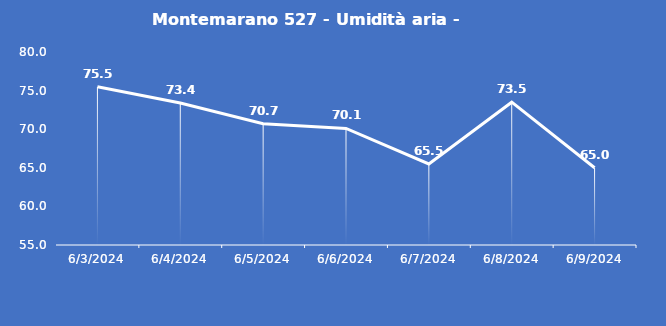
| Category | Montemarano 527 - Umidità aria - Grezzo (%) |
|---|---|
| 6/3/24 | 75.5 |
| 6/4/24 | 73.4 |
| 6/5/24 | 70.7 |
| 6/6/24 | 70.1 |
| 6/7/24 | 65.5 |
| 6/8/24 | 73.5 |
| 6/9/24 | 65 |